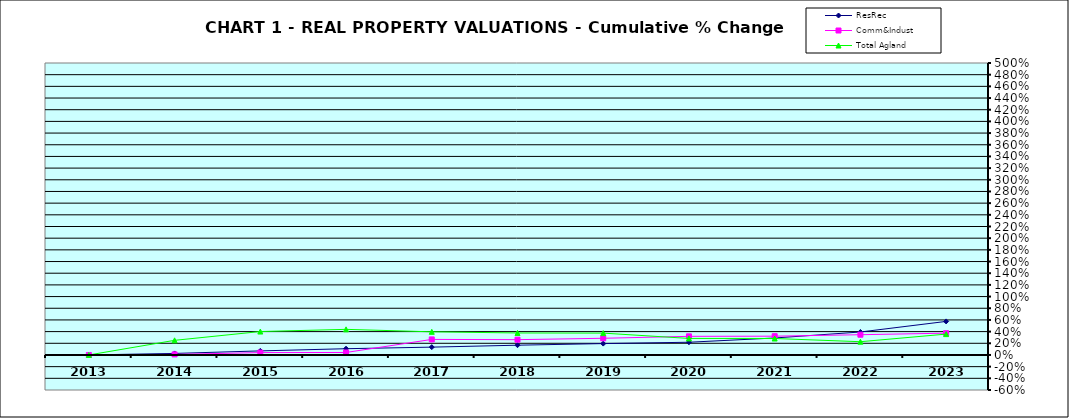
| Category | ResRec | Comm&Indust | Total Agland |
|---|---|---|---|
| 2013.0 | 0 | 0 | 0 |
| 2014.0 | 0.026 | 0.01 | 0.251 |
| 2015.0 | 0.07 | 0.041 | 0.401 |
| 2016.0 | 0.107 | 0.043 | 0.439 |
| 2017.0 | 0.134 | 0.266 | 0.396 |
| 2018.0 | 0.167 | 0.262 | 0.376 |
| 2019.0 | 0.195 | 0.286 | 0.374 |
| 2020.0 | 0.218 | 0.319 | 0.283 |
| 2021.0 | 0.291 | 0.322 | 0.282 |
| 2022.0 | 0.394 | 0.347 | 0.227 |
| 2023.0 | 0.575 | 0.373 | 0.357 |